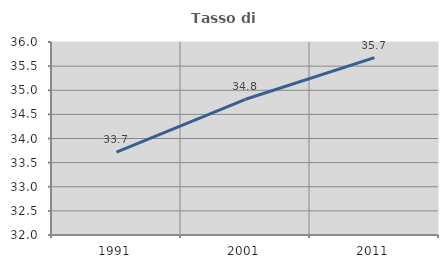
| Category | Tasso di occupazione   |
|---|---|
| 1991.0 | 33.716 |
| 2001.0 | 34.813 |
| 2011.0 | 35.676 |